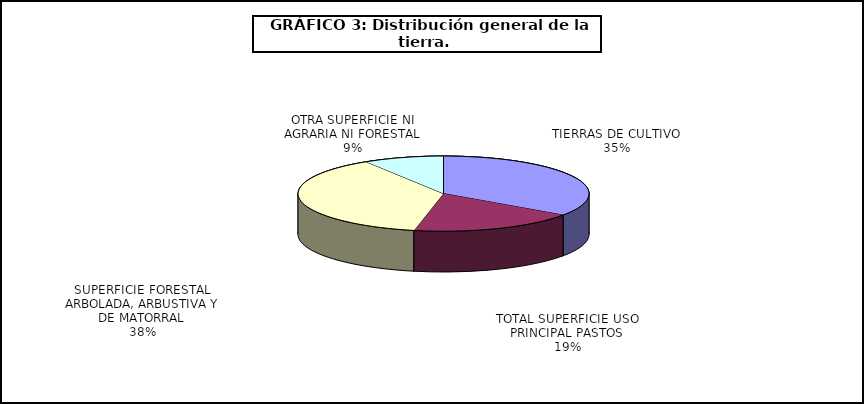
| Category | Series 0 |
|---|---|
| TIERRAS DE CULTIVO | 17539289 |
| TOTAL SUPERFICIE USO PRINCIPAL PASTOS | 9402705 |
| SUPERFICIE FORESTAL ARBOLADA, ARBUSTIVA Y DE MATORRAL | 19140518 |
| OTRA SUPERFICIE NI AGRARIA NI FORESTAL | 4511480 |